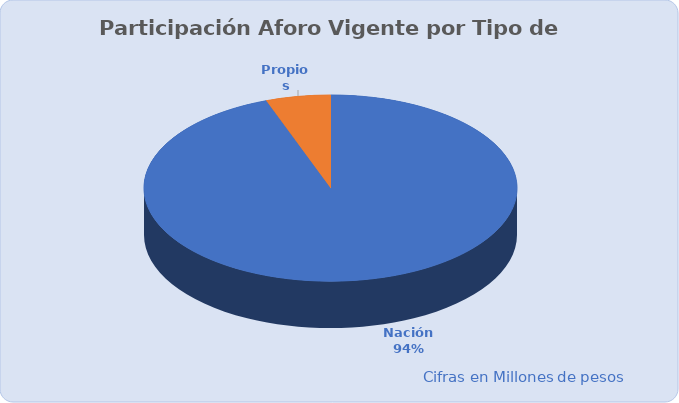
| Category | Total |
|---|---|
| Nación | 4425451.247 |
| Propios | 262400.001 |